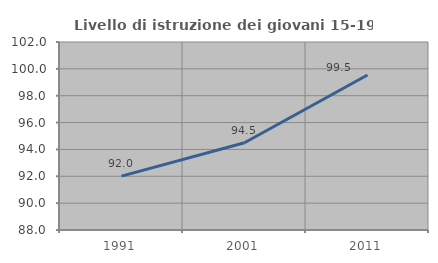
| Category | Livello di istruzione dei giovani 15-19 anni |
|---|---|
| 1991.0 | 92.014 |
| 2001.0 | 94.495 |
| 2011.0 | 99.545 |